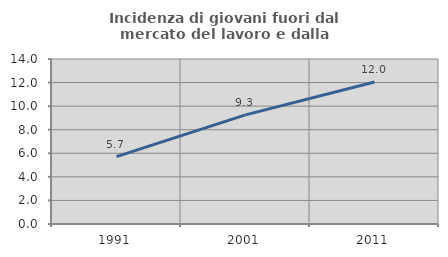
| Category | Incidenza di giovani fuori dal mercato del lavoro e dalla formazione  |
|---|---|
| 1991.0 | 5.714 |
| 2001.0 | 9.259 |
| 2011.0 | 12.048 |